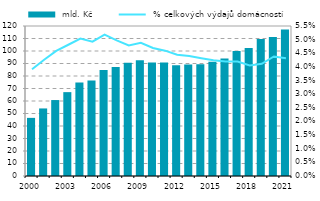
| Category |  mld. Kč |
|---|---|
| 2000.0 | 46.501 |
| 2001.0 | 54.043 |
| 2002.0 | 60.759 |
| 2003.0 | 67.091 |
| 2004.0 | 74.718 |
| 2005.0 | 76.372 |
| 2006.0 | 84.814 |
| 2007.0 | 87.219 |
| 2008.0 | 90.562 |
| 2009.0 | 92.643 |
| 2010.0 | 90.738 |
| 2011.0 | 90.74 |
| 2012.0 | 88.698 |
| 2013.0 | 89.123 |
| 2014.0 | 89.45 |
| 2015.0 | 91.39 |
| 2016.0 | 94.027 |
| 2017.0 | 99.995 |
| 2018.0 | 102.382 |
| 2019.0 | 109.608 |
| 2020.0 | 111.201 |
| 2021.0 | 117.268 |